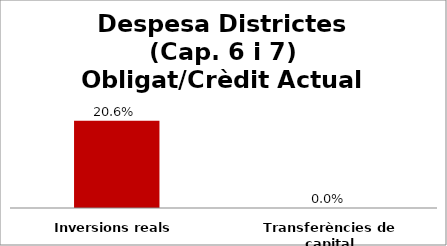
| Category | Series 0 |
|---|---|
| Inversions reals | 0.206 |
| Transferències de capital | 0 |